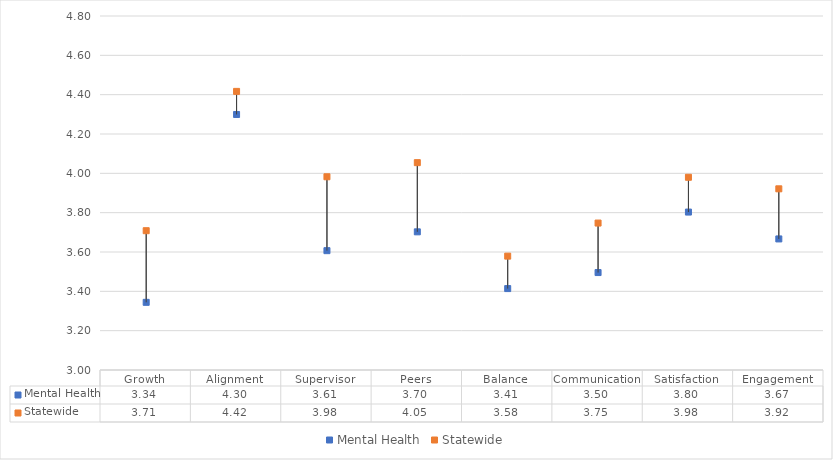
| Category | Mental Health | Statewide |
|---|---|---|
| Growth | 3.344 | 3.708 |
| Alignment | 4.299 | 4.417 |
| Supervisor | 3.607 | 3.983 |
| Peers | 3.703 | 4.054 |
| Balance | 3.414 | 3.579 |
| Communication | 3.496 | 3.747 |
| Satisfaction | 3.803 | 3.98 |
| Engagement | 3.666 | 3.921 |